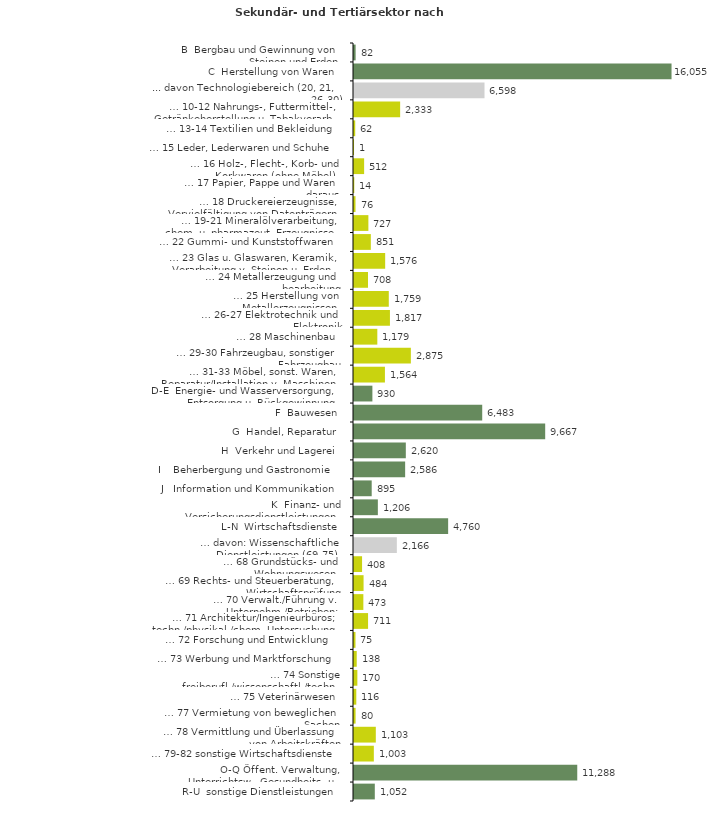
| Category | Series 0 |
|---|---|
| B  Bergbau und Gewinnung von Steinen und Erden | 82 |
| C  Herstellung von Waren | 16055 |
| ... davon Technologiebereich (20, 21, 26-30) | 6598 |
| … 10-12 Nahrungs-, Futtermittel-, Getränkeherstellung u. Tabakverarb. | 2333 |
| … 13-14 Textilien und Bekleidung | 62 |
| … 15 Leder, Lederwaren und Schuhe | 1 |
| … 16 Holz-, Flecht-, Korb- und Korkwaren (ohne Möbel)  | 512 |
| … 17 Papier, Pappe und Waren daraus  | 14 |
| … 18 Druckereierzeugnisse, Vervielfältigung von Datenträgern | 76 |
| … 19-21 Mineralölverarbeitung, chem. u. pharmazeut. Erzeugnisse | 727 |
| … 22 Gummi- und Kunststoffwaren | 851 |
| … 23 Glas u. Glaswaren, Keramik, Verarbeitung v. Steinen u. Erden  | 1576 |
| … 24 Metallerzeugung und -bearbeitung | 708 |
| … 25 Herstellung von Metallerzeugnissen  | 1759 |
| … 26-27 Elektrotechnik und Elektronik | 1817 |
| … 28 Maschinenbau | 1179 |
| … 29-30 Fahrzeugbau, sonstiger Fahrzeugbau | 2875 |
| … 31-33 Möbel, sonst. Waren, Reparatur/Installation v. Maschinen | 1564 |
| D-E  Energie- und Wasserversorgung, Entsorgung u. Rückgewinnung | 930 |
| F  Bauwesen | 6483 |
| G  Handel, Reparatur | 9667 |
| H  Verkehr und Lagerei | 2620 |
| I    Beherbergung und Gastronomie | 2586 |
| J   Information und Kommunikation | 895 |
| K  Finanz- und Versicherungsdienstleistungen | 1206 |
| L-N  Wirtschaftsdienste | 4760 |
| … davon: Wissenschaftliche Dienstleistungen (69-75) | 2166 |
| … 68 Grundstücks- und Wohnungswesen  | 408 |
| … 69 Rechts- und Steuerberatung, Wirtschaftsprüfung | 484 |
| … 70 Verwalt./Führung v. Unternehm./Betrieben; Unternehmensberat. | 473 |
| … 71 Architektur/Ingenieurbüros; techn./physikal./chem. Untersuchung | 711 |
| … 72 Forschung und Entwicklung  | 75 |
| … 73 Werbung und Marktforschung | 138 |
| … 74 Sonstige freiberufl./wissenschaftl./techn. Tätigkeiten | 170 |
| … 75 Veterinärwesen | 116 |
| … 77 Vermietung von beweglichen Sachen  | 80 |
| … 78 Vermittlung und Überlassung von Arbeitskräften | 1103 |
| … 79-82 sonstige Wirtschaftsdienste | 1003 |
| O-Q Öffent. Verwaltung, Unterrichtsw., Gesundheits- u. Sozialwesen | 11288 |
| R-U  sonstige Dienstleistungen | 1052 |